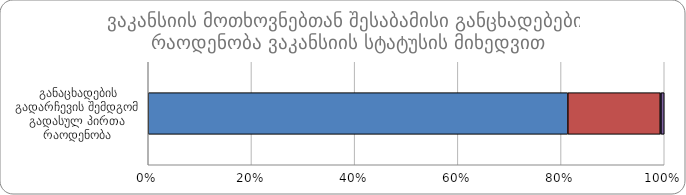
| Category |  დასრულებული |  ჩაშლილი |  შეწყვეტილი |  ინფორმაციის გარეშე |
|---|---|---|---|---|
|  განაცხადების გადარჩევის შემდგომ გადასულ პირთა რაოდენობა | 26396 | 5814 | 46 | 207 |